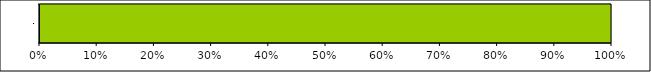
| Category | Series 0 | Series 1 | Series 2 | Series 3 |
|---|---|---|---|---|
| 0 | 0 | 0 | 4 | 0 |